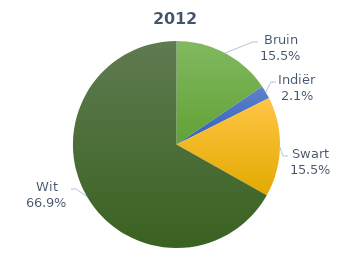
| Category | Series 0 |
|---|---|
| Bruin | 4319 |
| Indiër | 579 |
| Swart | 4323 |
| Wit | 18602 |